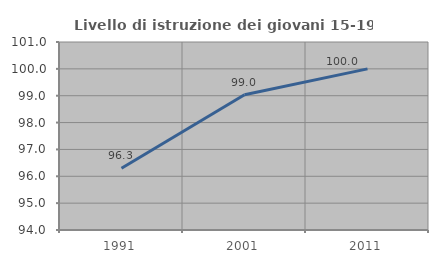
| Category | Livello di istruzione dei giovani 15-19 anni |
|---|---|
| 1991.0 | 96.296 |
| 2001.0 | 99.038 |
| 2011.0 | 100 |